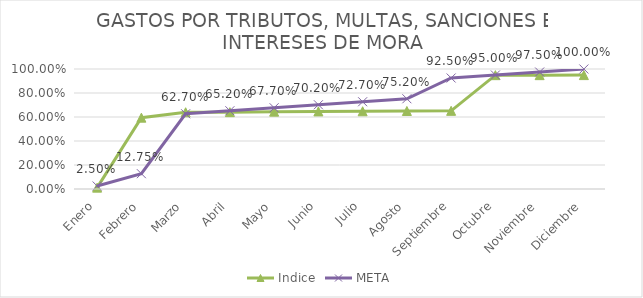
| Category | Indice | META |
|---|---|---|
| Enero | 0.011 | 0.025 |
| Febrero | 0.594 | 0.128 |
| Marzo | 0.64 | 0.627 |
| Abril | 0.64 | 0.652 |
| Mayo | 0.645 | 0.677 |
| Junio | 0.647 | 0.702 |
| Julio | 0.648 | 0.727 |
| Agosto | 0.65 | 0.752 |
| Septiembre | 0.651 | 0.925 |
| Octubre | 0.949 | 0.95 |
| Noviembre | 0.949 | 0.975 |
| Diciembre | 0.949 | 1 |